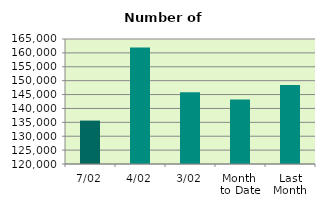
| Category | Series 0 |
|---|---|
| 7/02 | 135632 |
| 4/02 | 161974 |
| 3/02 | 145844 |
| Month 
to Date | 143185.2 |
| Last
Month | 148479.905 |